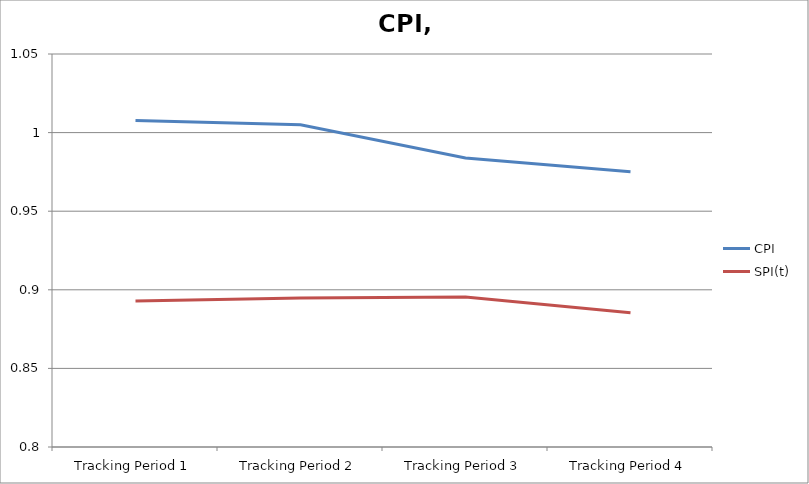
| Category | CPI | SPI(t) |
|---|---|---|
| Tracking Period 1 | 1.008 | 0.893 |
| Tracking Period 2 | 1.005 | 0.895 |
| Tracking Period 3 | 0.984 | 0.895 |
| Tracking Period 4 | 0.975 | 0.885 |